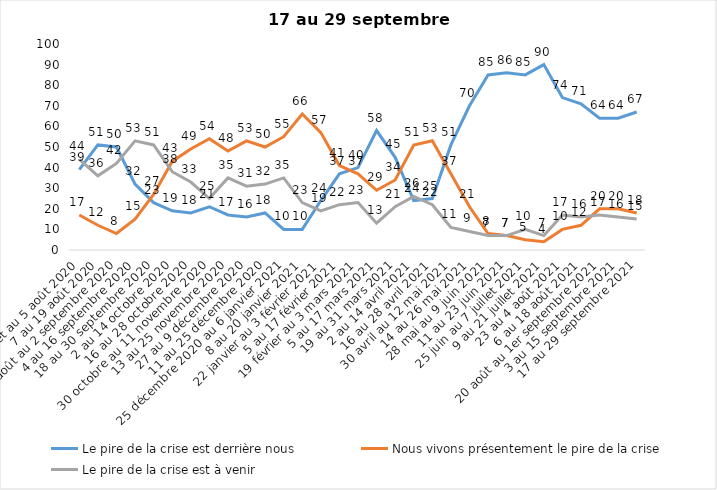
| Category | Le pire de la crise est derrière nous | Nous vivons présentement le pire de la crise | Le pire de la crise est à venir |
|---|---|---|---|
| 24 juillet au 5 août 2020 | 39 | 17 | 44 |
| 7 au 19 août 2020 | 51 | 12 | 36 |
| 21 août au 2 septembre 2020 | 50 | 8 | 42 |
| 4 au 16 septembre 2020 | 32 | 15 | 53 |
| 18 au 30 septembre 2020 | 23 | 27 | 51 |
| 2 au 14 octobre 2020 | 19 | 43 | 38 |
| 16 au 28 octobre 2020 | 18 | 49 | 33 |
| 30 octobre au 11 novembre 2020 | 21 | 54 | 25 |
| 13 au 25 novembre 2020 | 17 | 48 | 35 |
| 27 au 9 décembre 2020 | 16 | 53 | 31 |
| 11 au 25 décembre 2020 | 18 | 50 | 32 |
| 25 décembre 2020 au 6 janvier 2021 | 10 | 55 | 35 |
| 8 au 20 janvier 2021 | 10 | 66 | 23 |
| 22 janvier au 3 février 2021 | 24 | 57 | 19 |
| 5 au 17 février 2021 | 37 | 41 | 22 |
| 19 février au 3 mars 2021 | 40 | 37 | 23 |
| 5 au 17 mars 2021 | 58 | 29 | 13 |
| 19 au 31 mars 2021 | 45 | 34 | 21 |
| 2 au 14 avril 2021 | 24 | 51 | 26 |
| 16 au 28 avril 2021 | 25 | 53 | 22 |
| 30 avril au 12 mai 2021 | 51 | 37 | 11 |
| 14 au 26 mai 2021 | 70 | 21 | 9 |
| 28 mai au 9 juin 2021 | 85 | 8 | 7 |
| 11 au 23 juin 2021 | 86 | 7 | 7 |
| 25 juin au 7 juillet 2021 | 85 | 5 | 10 |
| 9 au 21 juillet 2021 | 90 | 4 | 7 |
| 23 au 4 août 2021 | 74 | 10 | 17 |
| 6 au 18 août 2021 | 71 | 12 | 16 |
| 20 août au 1er septembre 2021 | 64 | 20 | 17 |
| 3 au 15 septembre 2021 | 64 | 20 | 16 |
| 17 au 29 septembre 2021 | 67 | 18 | 15 |